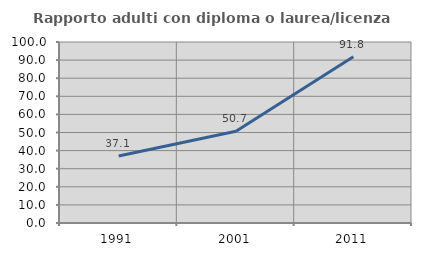
| Category | Rapporto adulti con diploma o laurea/licenza media  |
|---|---|
| 1991.0 | 37.063 |
| 2001.0 | 50.685 |
| 2011.0 | 91.803 |